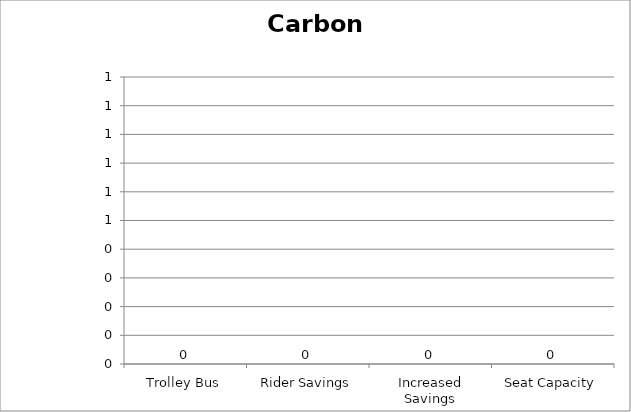
| Category | Carbon Monoxide |
|---|---|
| Trolley Bus | 0 |
| Rider Savings | 0 |
| Increased Savings | 0 |
| Seat Capacity | 0 |